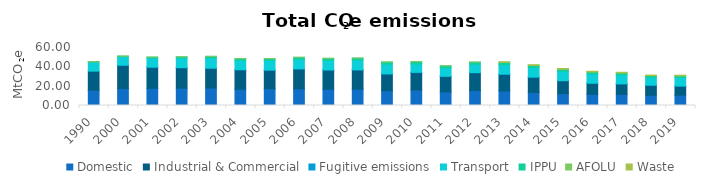
| Category | Domestic | Industrial & Commercial | Fugitive emissions | Transport | IPPU | AFOLU | Waste |
|---|---|---|---|---|---|---|---|
| 1990.0 | 15.84 | 19.74 | 0 | 9.474 | 0.135 | 0.175 | 0 |
| 2000.0 | 17.537 | 24.064 | 0.281 | 8.713 | 0.478 | 0.159 | 0 |
| 2001.0 | 17.792 | 21.757 | 0.308 | 9.309 | 0.82 | 0.155 | 0 |
| 2002.0 | 17.95 | 21.103 | 0.191 | 9.882 | 1.162 | 0.152 | 0 |
| 2003.0 | 18.109 | 20.448 | 0.262 | 10.454 | 1.505 | 0.149 | 0 |
| 2004.0 | 16.849 | 20.055 | 0.263 | 9.654 | 1.647 | 0.145 | 0 |
| 2005.0 | 17.31 | 19.229 | 0.249 | 9.862 | 1.818 | 0.14 | 0 |
| 2006.0 | 17.224 | 20.62 | 0.239 | 9.794 | 1.919 | 0.138 | 0 |
| 2007.0 | 16.838 | 19.847 | 0.237 | 9.794 | 2.015 | 0.133 | 0 |
| 2008.0 | 16.926 | 19.852 | 0.234 | 9.895 | 2.078 | 0.132 | 0 |
| 2009.0 | 15.251 | 17.378 | 0.234 | 9.895 | 2.16 | 0.13 | 0 |
| 2010.0 | 16.004 | 18.213 | 0.233 | 8.515 | 2.287 | 0.132 | 0 |
| 2011.0 | 14.047 | 16.116 | 0.191 | 8.578 | 2.071 | 0.13 | 0 |
| 2012.0 | 15.475 | 18.398 | 0.209 | 8.578 | 2.146 | 0.129 | 0 |
| 2013.0 | 15.065 | 17.278 | 0.213 | 9.822 | 2.184 | 0.125 | 0.548 |
| 2014.0 | 13.529 | 15.815 | 0.188 | 9.728 | 2.213 | 0.128 | 0.558 |
| 2015.0 | 12.296 | 13.313 | 0.176 | 9.599 | 2.212 | 0.122 | 0.531 |
| 2016.0 | 11.579 | 11.44 | 0.184 | 9.441 | 2.112 | 0.122 | 0.563 |
| 2017.0 | 11.515 | 10.809 | 0.196 | 9.219 | 1.969 | 0.119 | 0.547 |
| 2018.0 | 10.568 | 10.419 | 0.189 | 7.85 | 1.862 | 0.119 | 0.473 |
| 2019.0 | 10.696 | 9.391 | 0.191 | 8.668 | 1.779 | 0.119 | 0.533 |